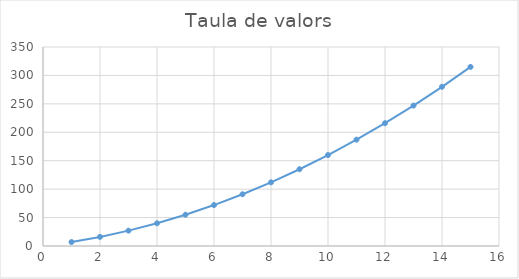
| Category | Series 0 |
|---|---|
| 1.0 | 7 |
| 2.0 | 16 |
| 3.0 | 27 |
| 4.0 | 40 |
| 5.0 | 55 |
| 6.0 | 72 |
| 7.0 | 91 |
| 8.0 | 112 |
| 9.0 | 135 |
| 10.0 | 160 |
| 11.0 | 187 |
| 12.0 | 216 |
| 13.0 | 247 |
| 14.0 | 280 |
| 15.0 | 315 |